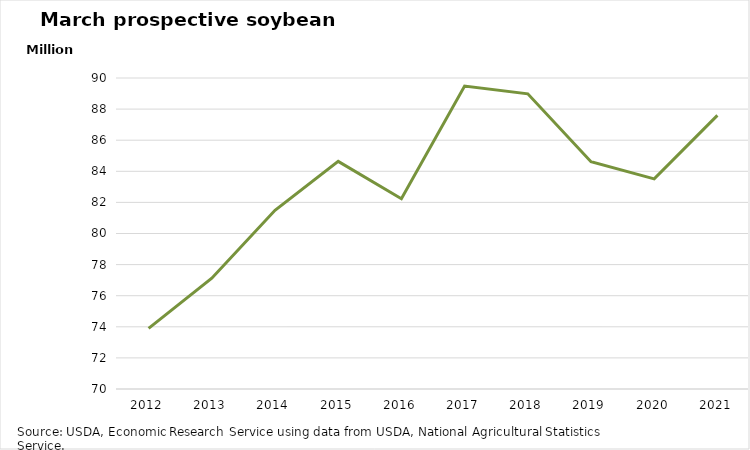
| Category | March Acreage 2021 |
|---|---|
| 2012.0 | 73902000 |
| 2013.0 | 77126000 |
| 2014.0 | 81493000 |
| 2015.0 | 84635000 |
| 2016.0 | 82236000 |
| 2017.0 | 89482000 |
| 2018.0 | 88982000 |
| 2019.0 | 84617000 |
| 2020.0 | 83510000 |
| 2021.0 | 87600000 |